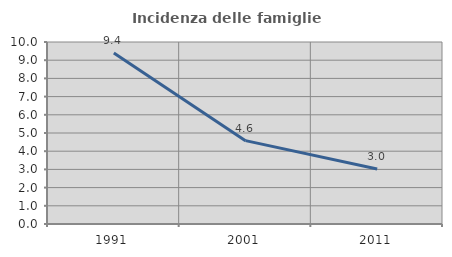
| Category | Incidenza delle famiglie numerose |
|---|---|
| 1991.0 | 9.402 |
| 2001.0 | 4.58 |
| 2011.0 | 3.021 |